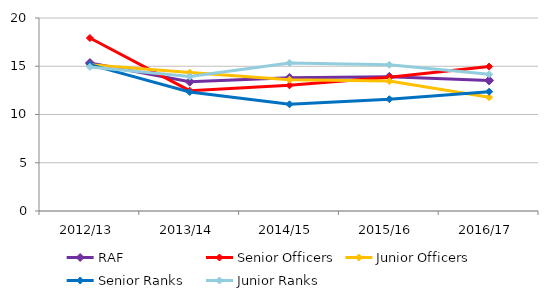
| Category | RAF | Senior Officers | Junior Officers | Senior Ranks | Junior Ranks |
|---|---|---|---|---|---|
| 2012/13 | 15.329 | 17.927 | 15.164 | 15.166 | 14.933 |
| 2013/14 | 13.401 | 12.468 | 14.341 | 12.331 | 13.929 |
| 2014/15 | 13.796 | 13.022 | 13.606 | 11.059 | 15.346 |
| 2015/16 | 13.903 | 13.863 | 13.46 | 11.584 | 15.151 |
| 2016/17 | 13.531 | 14.965 | 11.786 | 12.365 | 14.163 |